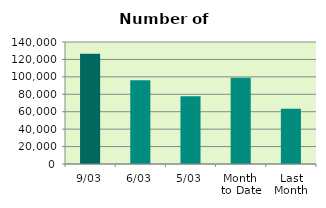
| Category | Series 0 |
|---|---|
| 9/03 | 126558 |
| 6/03 | 96160 |
| 5/03 | 77700 |
| Month 
to Date | 98870.667 |
| Last
Month | 63353.4 |